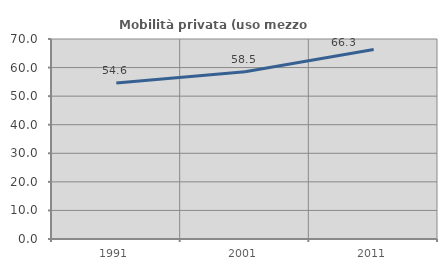
| Category | Mobilità privata (uso mezzo privato) |
|---|---|
| 1991.0 | 54.635 |
| 2001.0 | 58.534 |
| 2011.0 | 66.312 |